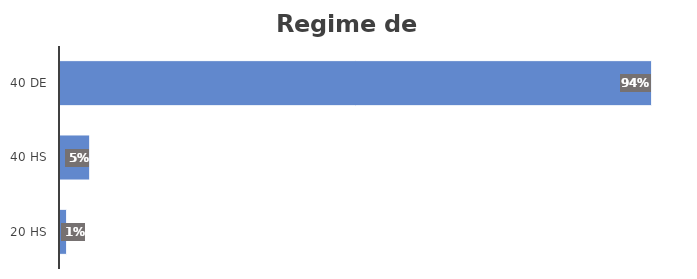
| Category | Series 0 |
|---|---|
| 20 HS | 0.011 |
| 40 HS | 0.047 |
| 40 DE | 0.942 |